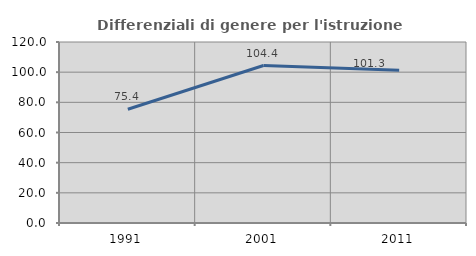
| Category | Differenziali di genere per l'istruzione superiore |
|---|---|
| 1991.0 | 75.408 |
| 2001.0 | 104.391 |
| 2011.0 | 101.347 |